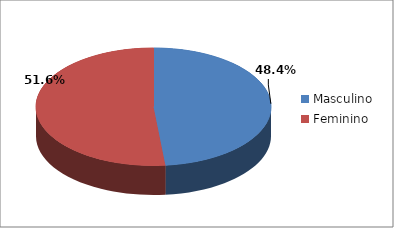
| Category | Series 0 |
|---|---|
| Masculino | 60 |
| Feminino | 64 |